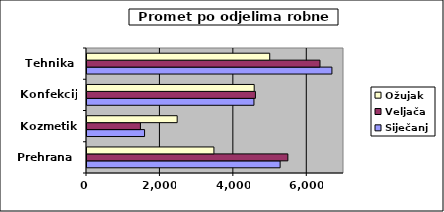
| Category | Siječanj | Veljača | Ožujak |
|---|---|---|---|
| Prehrana | 5260 | 5471 | 3457 |
| Kozmetika | 1568 | 1455 | 2456 |
| Konfekcija | 4547 | 4587 | 4554 |
| Tehnika | 6671 | 6346 | 4977 |